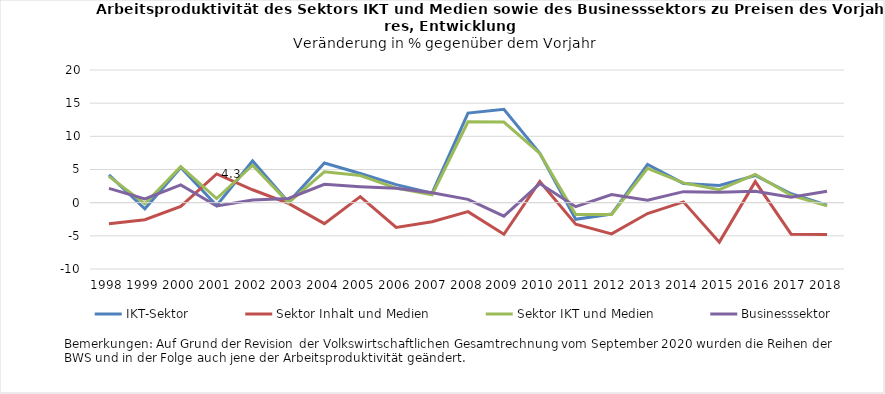
| Category | IKT-Sektor | Sektor Inhalt und Medien | Sektor IKT und Medien | Businesssektor |
|---|---|---|---|---|
| 1998.0 | 4.199 | -3.191 | 3.964 | 2.148 |
| 1999.0 | -0.922 | -2.578 | -0.153 | 0.555 |
| 2000.0 | 5.306 | -0.564 | 5.423 | 2.674 |
| 2001.0 | -0.413 | 4.335 | 0.628 | -0.499 |
| 2002.0 | 6.289 | 1.946 | 5.638 | 0.416 |
| 2003.0 | 0.07 | -0.114 | 0.003 | 0.636 |
| 2004.0 | 5.978 | -3.159 | 4.645 | 2.767 |
| 2005.0 | 4.388 | 0.906 | 4.085 | 2.417 |
| 2006.0 | 2.722 | -3.722 | 2.188 | 2.169 |
| 2007.0 | 1.428 | -2.875 | 1.195 | 1.486 |
| 2008.0 | 13.507 | -1.349 | 12.18 | 0.496 |
| 2009.0 | 14.067 | -4.77 | 12.149 | -2.041 |
| 2010.0 | 7.431 | 3.194 | 7.432 | 2.884 |
| 2011.0 | -2.501 | -3.249 | -1.788 | -0.609 |
| 2012.0 | -1.721 | -4.7 | -1.775 | 1.212 |
| 2013.0 | 5.747 | -1.641 | 5.173 | 0.386 |
| 2014.0 | 2.902 | 0.122 | 2.982 | 1.659 |
| 2015.0 | 2.595 | -5.948 | 1.948 | 1.577 |
| 2016.0 | 4.096 | 3.168 | 4.264 | 1.728 |
| 2017.0 | 1.349 | -4.75 | 1.109 | 0.815 |
| 2018.0 | -0.388 | -4.817 | -0.483 | 1.721 |